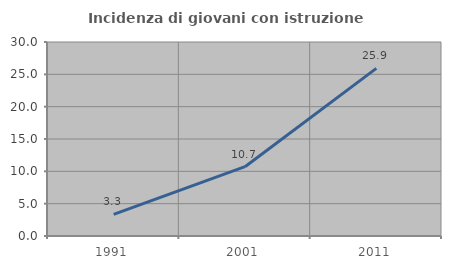
| Category | Incidenza di giovani con istruzione universitaria |
|---|---|
| 1991.0 | 3.333 |
| 2001.0 | 10.714 |
| 2011.0 | 25.926 |